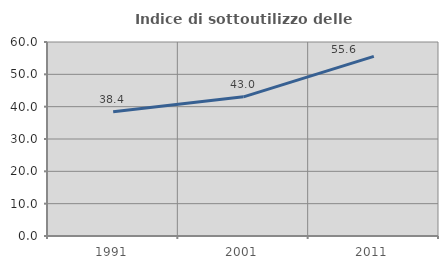
| Category | Indice di sottoutilizzo delle abitazioni  |
|---|---|
| 1991.0 | 38.424 |
| 2001.0 | 43.038 |
| 2011.0 | 55.556 |